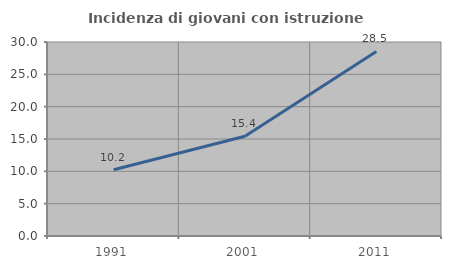
| Category | Incidenza di giovani con istruzione universitaria |
|---|---|
| 1991.0 | 10.249 |
| 2001.0 | 15.429 |
| 2011.0 | 28.536 |